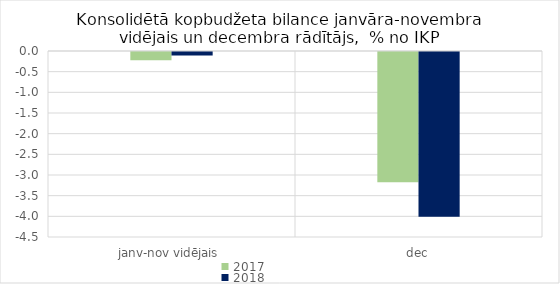
| Category | 2017 | 2018 |
|---|---|---|
| janv-nov vidējais | -0.202 | -0.083 |
| dec | -3.149 | -3.987 |